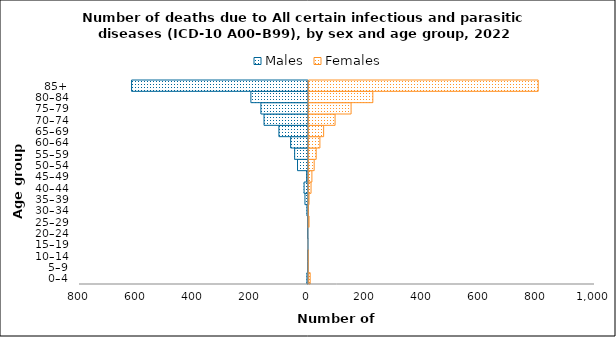
| Category | Males | Females |
|---|---|---|
| 0–4 | -5 | 8 |
| 5–9 | -3 | 1 |
| 10–14 | -3 | 1 |
| 15–19 | -1 | 0 |
| 20–24 | -3 | 0 |
| 25–29 | -3 | 4 |
| 30–34 | -5 | 2 |
| 35–39 | -12 | 4 |
| 40–44 | -15 | 11 |
| 45–49 | -6 | 14 |
| 50–54 | -38 | 22 |
| 55–59 | -48 | 29 |
| 60–64 | -62 | 42 |
| 65–69 | -103 | 55 |
| 70–74 | -155 | 95 |
| 75–79 | -166 | 151 |
| 80–84 | -201 | 227 |
| 85+ | -618 | 805 |